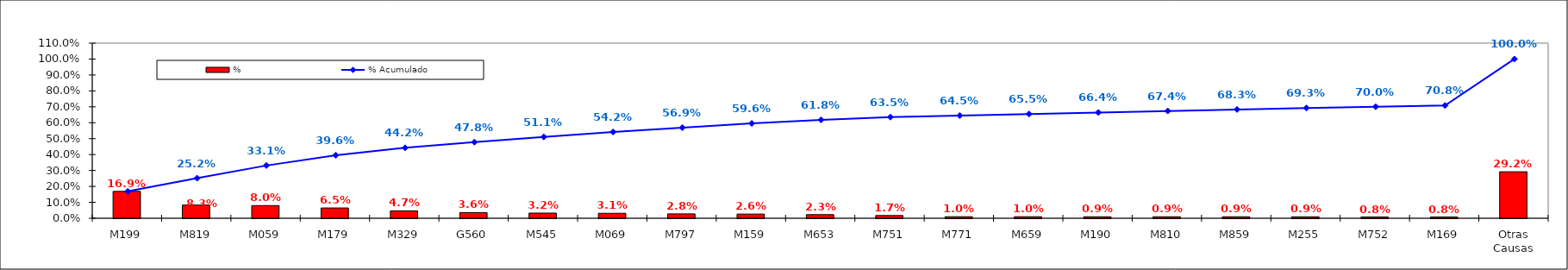
| Category | % |
|---|---|
| M199 | 0.169 |
| M819 | 0.083 |
| M059 | 0.08 |
| M179 | 0.065 |
| M329 | 0.047 |
| G560 | 0.036 |
| M545 | 0.032 |
| M069 | 0.031 |
| M797 | 0.028 |
| M159 | 0.026 |
| M653 | 0.023 |
| M751 | 0.017 |
| M771 | 0.01 |
| M659 | 0.01 |
| M190 | 0.009 |
| M810 | 0.009 |
| M859 | 0.009 |
| M255 | 0.009 |
| M752 | 0.008 |
| M169 | 0.008 |
| Otras Causas | 0.292 |